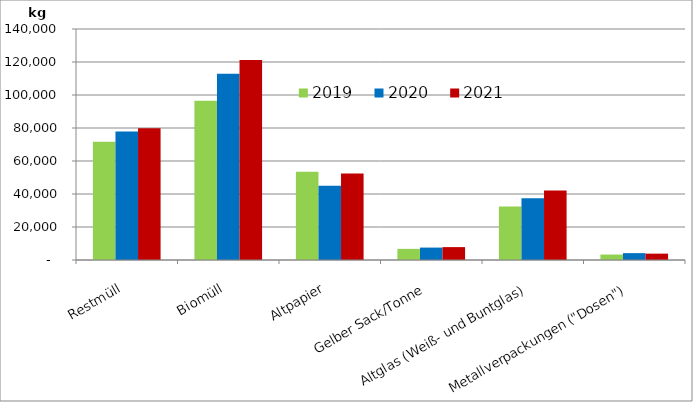
| Category | 2019 | 2020 | 2021 |
|---|---|---|---|
| Restmüll | 71620 | 77950 | 79900 |
| Biomüll | 96590 | 112830 | 121150 |
| Altpapier | 53530 | 44950 | 52370 |
| Gelber Sack/Tonne | 6737 | 7522 | 7811 |
| Altglas (Weiß- und Buntglas) | 32490 | 37400 | 42120 |
| Metallverpackungen ("Dosen") | 3307.307 | 4158.851 | 3858.765 |